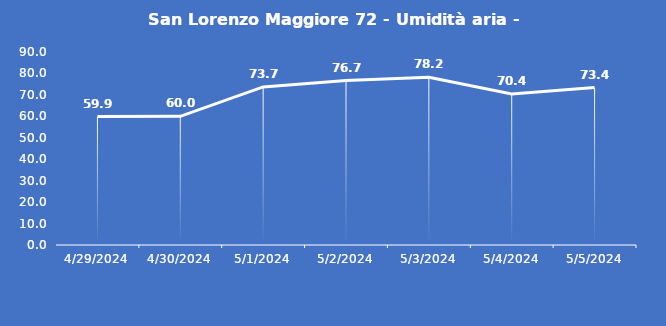
| Category | San Lorenzo Maggiore 72 - Umidità aria - Grezzo (%) |
|---|---|
| 4/29/24 | 59.9 |
| 4/30/24 | 60 |
| 5/1/24 | 73.7 |
| 5/2/24 | 76.7 |
| 5/3/24 | 78.2 |
| 5/4/24 | 70.4 |
| 5/5/24 | 73.4 |